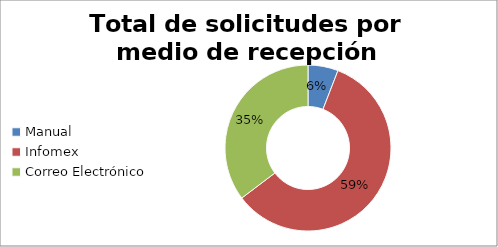
| Category | totales |
|---|---|
| Manual | 1 |
| Infomex | 10 |
| Correo Electrónico | 6 |